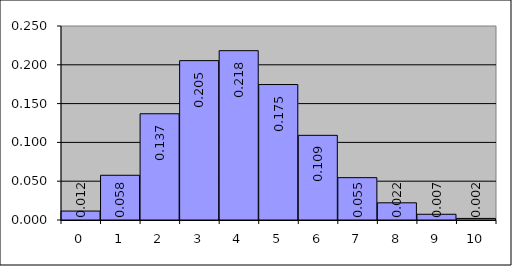
| Category | Series 0 |
|---|---|
| 0.0 | 0.012 |
| 1.0 | 0.058 |
| 2.0 | 0.137 |
| 3.0 | 0.205 |
| 4.0 | 0.218 |
| 5.0 | 0.175 |
| 6.0 | 0.109 |
| 7.0 | 0.055 |
| 8.0 | 0.022 |
| 9.0 | 0.007 |
| 10.0 | 0.002 |